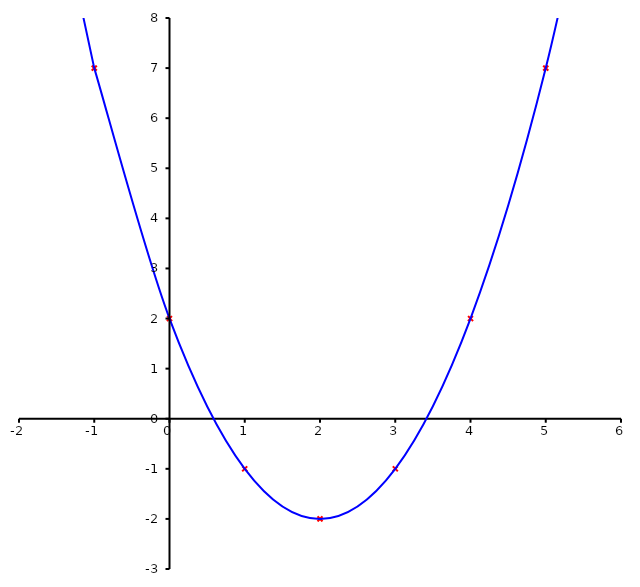
| Category | Series 0 |
|---|---|
| -2.0 | 14 |
| -1.0 | 7 |
| 0.0 | 2 |
| 1.0 | -1 |
| 2.0 | -2 |
| 3.0 | -1 |
| 4.0 | 2 |
| 5.0 | 7 |
| 6.0 | 14 |